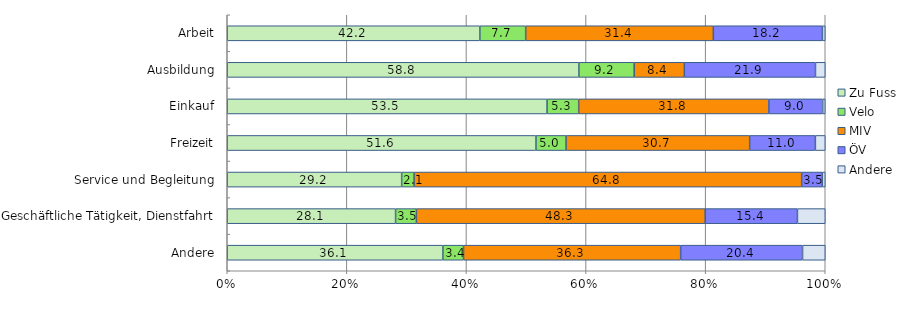
| Category | Zu Fuss | Velo | MIV | ÖV | Andere |
|---|---|---|---|---|---|
| Arbeit | 42.241 | 7.664 | 31.383 | 18.237 | 0.475 |
| Ausbildung | 58.802 | 9.244 | 8.398 | 21.921 | 1.634 |
| Einkauf | 53.478 | 5.293 | 31.802 | 8.998 | 0.428 |
| Freizeit | 51.623 | 5.034 | 30.703 | 10.99 | 1.65 |
| Service und Begleitung | 29.165 | 2.079 | 64.811 | 3.458 | 0.487 |
| Geschäftliche Tätigkeit, Dienstfahrt | 28.15 | 3.477 | 48.3 | 15.424 | 4.649 |
| Andere | 36.065 | 3.445 | 36.317 | 20.378 | 3.795 |